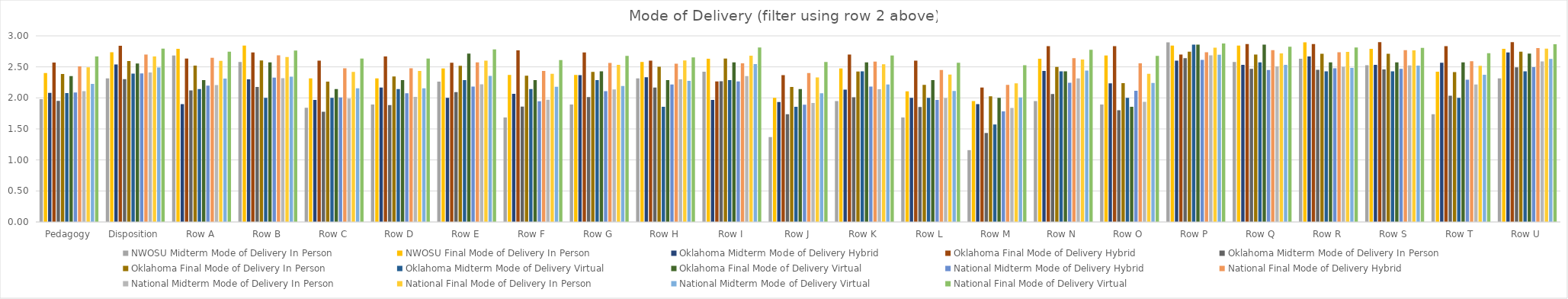
| Category | NWOSU | Oklahoma | National |
|---|---|---|---|
| Pedagogy | 2.401 | 2.352 | 2.667 |
| Disposition | 2.737 | 2.554 | 2.795 |
| Row A | 2.79 | 2.286 | 2.745 |
| Row B | 2.842 | 2.571 | 2.764 |
| Row C | 2.316 | 2.143 | 2.634 |
| Row D | 2.316 | 2.286 | 2.634 |
| Row E | 2.474 | 2.714 | 2.783 |
| Row F | 2.368 | 2.286 | 2.609 |
| Row G | 2.368 | 2.429 | 2.677 |
| Row H | 2.579 | 2.286 | 2.652 |
| Row I | 2.632 | 2.571 | 2.814 |
| Row J | 2 | 2.143 | 2.578 |
| Row K | 2.474 | 2.571 | 2.683 |
| Row L | 2.105 | 2.286 | 2.565 |
| Row M | 1.947 | 2 | 2.528 |
| Row N | 2.632 | 2.429 | 2.776 |
| Row O | 2.684 | 1.857 | 2.677 |
| Row P | 2.842 | 2.857 | 2.876 |
| Row Q | 2.842 | 2.857 | 2.826 |
| Row R | 2.895 | 2.571 | 2.814 |
| Row S | 2.79 | 2.571 | 2.808 |
| Row T | 2.421 | 2.571 | 2.72 |
| Row U | 2.79 | 2.714 | 2.863 |